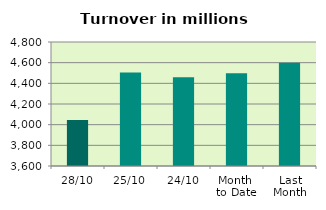
| Category | Series 0 |
|---|---|
| 28/10 | 4045.66 |
| 25/10 | 4504.081 |
| 24/10 | 4458.968 |
| Month 
to Date | 4497.467 |
| Last
Month | 4598.075 |